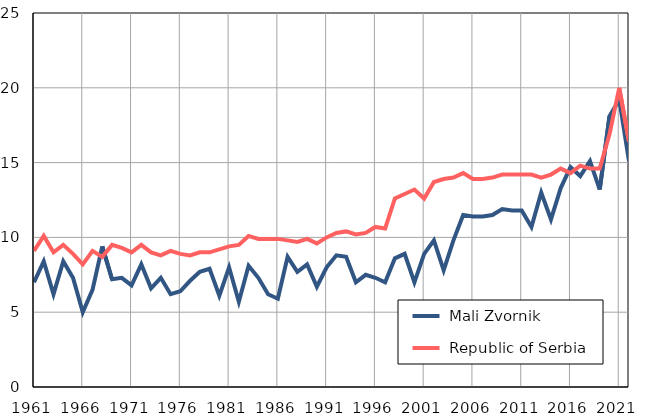
| Category |  Mali Zvornik |  Republic of Serbia |
|---|---|---|
| 1961.0 | 7 | 9.1 |
| 1962.0 | 8.4 | 10.1 |
| 1963.0 | 6.2 | 9 |
| 1964.0 | 8.4 | 9.5 |
| 1965.0 | 7.3 | 8.9 |
| 1966.0 | 5 | 8.2 |
| 1967.0 | 6.5 | 9.1 |
| 1968.0 | 9.4 | 8.7 |
| 1969.0 | 7.2 | 9.5 |
| 1970.0 | 7.3 | 9.3 |
| 1971.0 | 6.8 | 9 |
| 1972.0 | 8.2 | 9.5 |
| 1973.0 | 6.6 | 9 |
| 1974.0 | 7.3 | 8.8 |
| 1975.0 | 6.2 | 9.1 |
| 1976.0 | 6.4 | 8.9 |
| 1977.0 | 7.1 | 8.8 |
| 1978.0 | 7.7 | 9 |
| 1979.0 | 7.9 | 9 |
| 1980.0 | 6.1 | 9.2 |
| 1981.0 | 8 | 9.4 |
| 1982.0 | 5.7 | 9.5 |
| 1983.0 | 8.1 | 10.1 |
| 1984.0 | 7.3 | 9.9 |
| 1985.0 | 6.2 | 9.9 |
| 1986.0 | 5.9 | 9.9 |
| 1987.0 | 8.7 | 9.8 |
| 1988.0 | 7.7 | 9.7 |
| 1989.0 | 8.2 | 9.9 |
| 1990.0 | 6.7 | 9.6 |
| 1991.0 | 8 | 10 |
| 1992.0 | 8.8 | 10.3 |
| 1993.0 | 8.7 | 10.4 |
| 1994.0 | 7 | 10.2 |
| 1995.0 | 7.5 | 10.3 |
| 1996.0 | 7.3 | 10.7 |
| 1997.0 | 7 | 10.6 |
| 1998.0 | 8.6 | 12.6 |
| 1999.0 | 8.9 | 12.9 |
| 2000.0 | 7 | 13.2 |
| 2001.0 | 8.9 | 12.6 |
| 2002.0 | 9.8 | 13.7 |
| 2003.0 | 7.8 | 13.9 |
| 2004.0 | 9.8 | 14 |
| 2005.0 | 11.5 | 14.3 |
| 2006.0 | 11.4 | 13.9 |
| 2007.0 | 11.4 | 13.9 |
| 2008.0 | 11.5 | 14 |
| 2009.0 | 11.9 | 14.2 |
| 2010.0 | 11.8 | 14.2 |
| 2011.0 | 11.8 | 14.2 |
| 2012.0 | 10.7 | 14.2 |
| 2013.0 | 13 | 14 |
| 2014.0 | 11.2 | 14.2 |
| 2015.0 | 13.3 | 14.6 |
| 2016.0 | 14.7 | 14.3 |
| 2017.0 | 14.1 | 14.8 |
| 2018.0 | 15.1 | 14.6 |
| 2019.0 | 13.2 | 14.6 |
| 2020.0 | 18.1 | 16.9 |
| 2021.0 | 19.2 | 20 |
| 2022.0 | 15.1 | 16.4 |